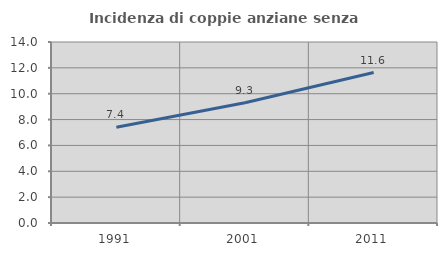
| Category | Incidenza di coppie anziane senza figli  |
|---|---|
| 1991.0 | 7.402 |
| 2001.0 | 9.301 |
| 2011.0 | 11.64 |